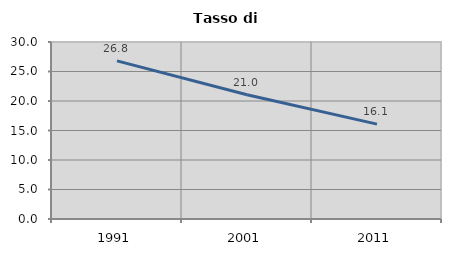
| Category | Tasso di disoccupazione   |
|---|---|
| 1991.0 | 26.808 |
| 2001.0 | 21.05 |
| 2011.0 | 16.075 |